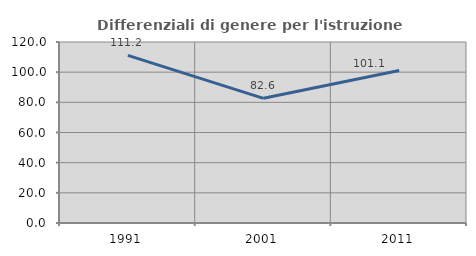
| Category | Differenziali di genere per l'istruzione superiore |
|---|---|
| 1991.0 | 111.177 |
| 2001.0 | 82.648 |
| 2011.0 | 101.139 |